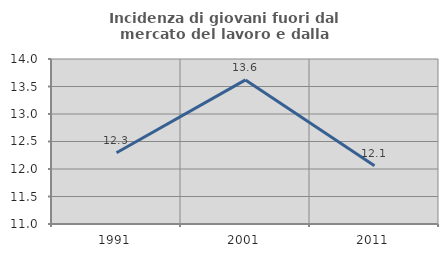
| Category | Incidenza di giovani fuori dal mercato del lavoro e dalla formazione  |
|---|---|
| 1991.0 | 12.295 |
| 2001.0 | 13.62 |
| 2011.0 | 12.059 |